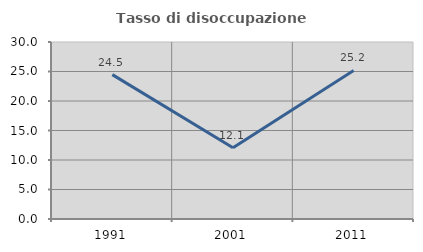
| Category | Tasso di disoccupazione giovanile  |
|---|---|
| 1991.0 | 24.47 |
| 2001.0 | 12.062 |
| 2011.0 | 25.17 |